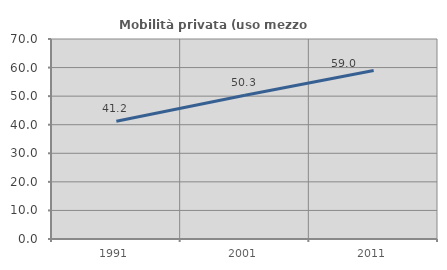
| Category | Mobilità privata (uso mezzo privato) |
|---|---|
| 1991.0 | 41.206 |
| 2001.0 | 50.294 |
| 2011.0 | 58.952 |